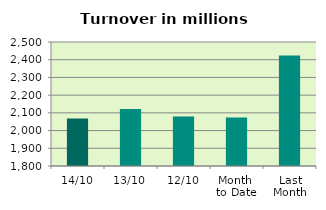
| Category | Series 0 |
|---|---|
| 14/10 | 2067.676 |
| 13/10 | 2122.161 |
| 12/10 | 2079.446 |
| Month 
to Date | 2073.123 |
| Last
Month | 2424.403 |